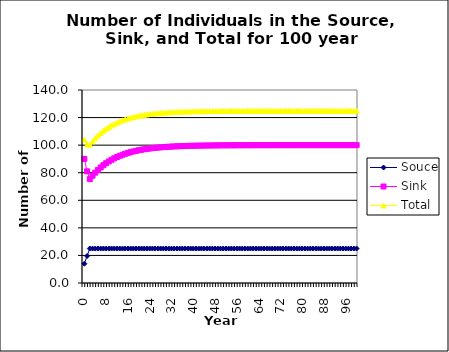
| Category | Souce | Sink | Total |
|---|---|---|---|
| 0.0 | 14 | 90 | 104 |
| 1.0 | 19.6 | 81 | 100.6 |
| 2.0 | 25 | 75.34 | 100.34 |
| 3.0 | 25 | 77.806 | 102.806 |
| 4.0 | 25 | 80.025 | 105.025 |
| 5.0 | 25 | 82.023 | 107.023 |
| 6.0 | 25 | 83.821 | 108.821 |
| 7.0 | 25 | 85.439 | 110.439 |
| 8.0 | 25 | 86.895 | 111.895 |
| 9.0 | 25 | 88.205 | 113.205 |
| 10.0 | 25 | 89.385 | 114.385 |
| 11.0 | 25 | 90.446 | 115.446 |
| 12.0 | 25 | 91.402 | 116.402 |
| 13.0 | 25 | 92.261 | 117.261 |
| 14.0 | 25 | 93.035 | 118.035 |
| 15.0 | 25 | 93.732 | 118.732 |
| 16.0 | 25 | 94.359 | 119.359 |
| 17.0 | 25 | 94.923 | 119.923 |
| 18.0 | 25 | 95.43 | 120.43 |
| 19.0 | 25 | 95.887 | 120.887 |
| 20.0 | 25 | 96.299 | 121.299 |
| 21.0 | 25 | 96.669 | 121.669 |
| 22.0 | 25 | 97.002 | 122.002 |
| 23.0 | 25 | 97.302 | 122.302 |
| 24.0 | 25 | 97.572 | 122.572 |
| 25.0 | 25 | 97.814 | 122.814 |
| 26.0 | 25 | 98.033 | 123.033 |
| 27.0 | 25 | 98.23 | 123.23 |
| 28.0 | 25 | 98.407 | 123.407 |
| 29.0 | 25 | 98.566 | 123.566 |
| 30.0 | 25 | 98.709 | 123.709 |
| 31.0 | 25 | 98.838 | 123.838 |
| 32.0 | 25 | 98.955 | 123.955 |
| 33.0 | 25 | 99.059 | 124.059 |
| 34.0 | 25 | 99.153 | 124.153 |
| 35.0 | 25 | 99.238 | 124.238 |
| 36.0 | 25 | 99.314 | 124.314 |
| 37.0 | 25 | 99.383 | 124.383 |
| 38.0 | 25 | 99.444 | 124.444 |
| 39.0 | 25 | 99.5 | 124.5 |
| 40.0 | 25 | 99.55 | 124.55 |
| 41.0 | 25 | 99.595 | 124.595 |
| 42.0 | 25 | 99.636 | 124.636 |
| 43.0 | 25 | 99.672 | 124.672 |
| 44.0 | 25 | 99.705 | 124.705 |
| 45.0 | 25 | 99.734 | 124.734 |
| 46.0 | 25 | 99.761 | 124.761 |
| 47.0 | 25 | 99.785 | 124.785 |
| 48.0 | 25 | 99.806 | 124.806 |
| 49.0 | 25 | 99.826 | 124.826 |
| 50.0 | 25 | 99.843 | 124.843 |
| 51.0 | 25 | 99.859 | 124.859 |
| 52.0 | 25 | 99.873 | 124.873 |
| 53.0 | 25 | 99.886 | 124.886 |
| 54.0 | 25 | 99.897 | 124.897 |
| 55.0 | 25 | 99.907 | 124.907 |
| 56.0 | 25 | 99.917 | 124.917 |
| 57.0 | 25 | 99.925 | 124.925 |
| 58.0 | 25 | 99.932 | 124.932 |
| 59.0 | 25 | 99.939 | 124.939 |
| 60.0 | 25 | 99.945 | 124.945 |
| 61.0 | 25 | 99.951 | 124.951 |
| 62.0 | 25 | 99.956 | 124.956 |
| 63.0 | 25 | 99.96 | 124.96 |
| 64.0 | 25 | 99.964 | 124.964 |
| 65.0 | 25 | 99.968 | 124.968 |
| 66.0 | 25 | 99.971 | 124.971 |
| 67.0 | 25 | 99.974 | 124.974 |
| 68.0 | 25 | 99.976 | 124.976 |
| 69.0 | 25 | 99.979 | 124.979 |
| 70.0 | 25 | 99.981 | 124.981 |
| 71.0 | 25 | 99.983 | 124.983 |
| 72.0 | 25 | 99.985 | 124.985 |
| 73.0 | 25 | 99.986 | 124.986 |
| 74.0 | 25 | 99.987 | 124.987 |
| 75.0 | 25 | 99.989 | 124.989 |
| 76.0 | 25 | 99.99 | 124.99 |
| 77.0 | 25 | 99.991 | 124.991 |
| 78.0 | 25 | 99.992 | 124.992 |
| 79.0 | 25 | 99.993 | 124.993 |
| 80.0 | 25 | 99.993 | 124.993 |
| 81.0 | 25 | 99.994 | 124.994 |
| 82.0 | 25 | 99.995 | 124.995 |
| 83.0 | 25 | 99.995 | 124.995 |
| 84.0 | 25 | 99.996 | 124.996 |
| 85.0 | 25 | 99.996 | 124.996 |
| 86.0 | 25 | 99.996 | 124.996 |
| 87.0 | 25 | 99.997 | 124.997 |
| 88.0 | 25 | 99.997 | 124.997 |
| 89.0 | 25 | 99.997 | 124.997 |
| 90.0 | 25 | 99.998 | 124.998 |
| 91.0 | 25 | 99.998 | 124.998 |
| 92.0 | 25 | 99.998 | 124.998 |
| 93.0 | 25 | 99.998 | 124.998 |
| 94.0 | 25 | 99.998 | 124.998 |
| 95.0 | 25 | 99.999 | 124.999 |
| 96.0 | 25 | 99.999 | 124.999 |
| 97.0 | 25 | 99.999 | 124.999 |
| 98.0 | 25 | 99.999 | 124.999 |
| 99.0 | 25 | 99.999 | 124.999 |
| 100.0 | 25 | 99.999 | 124.999 |